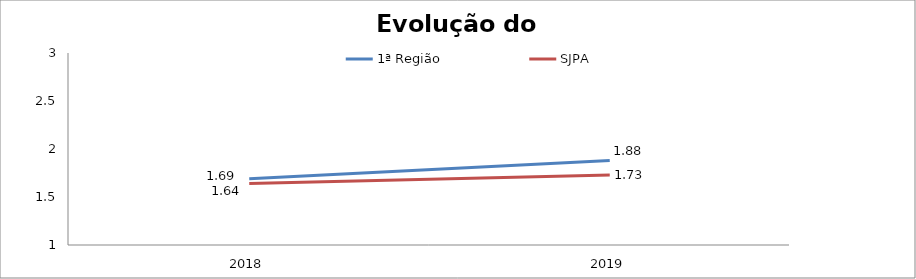
| Category | 1ª Região | SJPA |
|---|---|---|
| 2018.0 | 1.69 | 1.64 |
| 2019.0 | 1.88 | 1.73 |